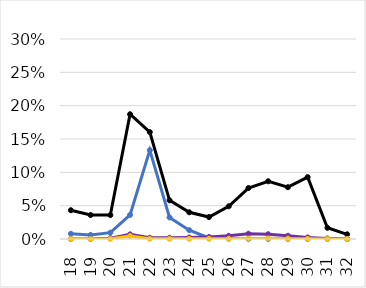
| Category | Total | miRNAs | TE | Virus |
|---|---|---|---|---|
| 18.0 | 0.043 | 0.008 | 0 | 0 |
| 19.0 | 0.036 | 0.006 | 0 | 0 |
| 20.0 | 0.036 | 0.01 | 0.001 | 0 |
| 21.0 | 0.187 | 0.036 | 0.007 | 0.004 |
| 22.0 | 0.16 | 0.133 | 0.002 | 0 |
| 23.0 | 0.058 | 0.032 | 0.002 | 0 |
| 24.0 | 0.04 | 0.013 | 0.002 | 0 |
| 25.0 | 0.033 | 0.001 | 0.003 | 0 |
| 26.0 | 0.049 | 0 | 0.005 | 0 |
| 27.0 | 0.076 | 0 | 0.008 | 0.001 |
| 28.0 | 0.087 | 0 | 0.007 | 0.001 |
| 29.0 | 0.078 | 0 | 0.005 | 0.001 |
| 30.0 | 0.093 | 0 | 0.002 | 0 |
| 31.0 | 0.017 | 0 | 0.001 | 0 |
| 32.0 | 0.007 | 0 | 0 | 0 |